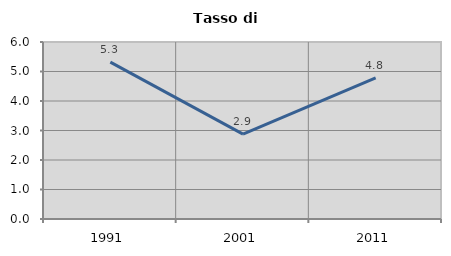
| Category | Tasso di disoccupazione   |
|---|---|
| 1991.0 | 5.319 |
| 2001.0 | 2.875 |
| 2011.0 | 4.786 |